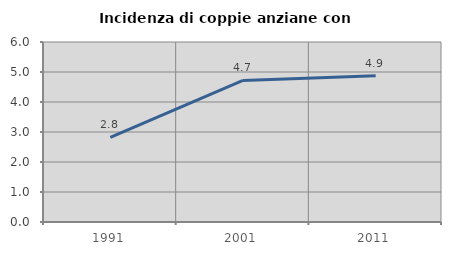
| Category | Incidenza di coppie anziane con figli |
|---|---|
| 1991.0 | 2.819 |
| 2001.0 | 4.718 |
| 2011.0 | 4.878 |